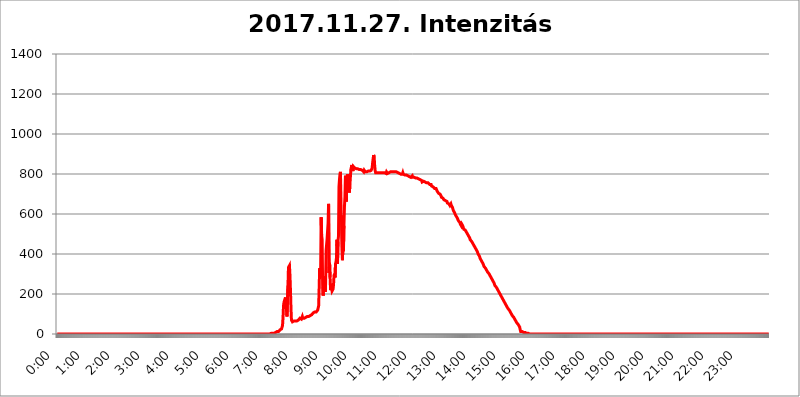
| Category | 2017.11.27. Intenzitás [W/m^2] |
|---|---|
| 0.0 | 0 |
| 0.0006944444444444445 | 0 |
| 0.001388888888888889 | 0 |
| 0.0020833333333333333 | 0 |
| 0.002777777777777778 | 0 |
| 0.003472222222222222 | 0 |
| 0.004166666666666667 | 0 |
| 0.004861111111111111 | 0 |
| 0.005555555555555556 | 0 |
| 0.0062499999999999995 | 0 |
| 0.006944444444444444 | 0 |
| 0.007638888888888889 | 0 |
| 0.008333333333333333 | 0 |
| 0.009027777777777779 | 0 |
| 0.009722222222222222 | 0 |
| 0.010416666666666666 | 0 |
| 0.011111111111111112 | 0 |
| 0.011805555555555555 | 0 |
| 0.012499999999999999 | 0 |
| 0.013194444444444444 | 0 |
| 0.013888888888888888 | 0 |
| 0.014583333333333332 | 0 |
| 0.015277777777777777 | 0 |
| 0.015972222222222224 | 0 |
| 0.016666666666666666 | 0 |
| 0.017361111111111112 | 0 |
| 0.018055555555555557 | 0 |
| 0.01875 | 0 |
| 0.019444444444444445 | 0 |
| 0.02013888888888889 | 0 |
| 0.020833333333333332 | 0 |
| 0.02152777777777778 | 0 |
| 0.022222222222222223 | 0 |
| 0.02291666666666667 | 0 |
| 0.02361111111111111 | 0 |
| 0.024305555555555556 | 0 |
| 0.024999999999999998 | 0 |
| 0.025694444444444447 | 0 |
| 0.02638888888888889 | 0 |
| 0.027083333333333334 | 0 |
| 0.027777777777777776 | 0 |
| 0.02847222222222222 | 0 |
| 0.029166666666666664 | 0 |
| 0.029861111111111113 | 0 |
| 0.030555555555555555 | 0 |
| 0.03125 | 0 |
| 0.03194444444444445 | 0 |
| 0.03263888888888889 | 0 |
| 0.03333333333333333 | 0 |
| 0.034027777777777775 | 0 |
| 0.034722222222222224 | 0 |
| 0.035416666666666666 | 0 |
| 0.036111111111111115 | 0 |
| 0.03680555555555556 | 0 |
| 0.0375 | 0 |
| 0.03819444444444444 | 0 |
| 0.03888888888888889 | 0 |
| 0.03958333333333333 | 0 |
| 0.04027777777777778 | 0 |
| 0.04097222222222222 | 0 |
| 0.041666666666666664 | 0 |
| 0.042361111111111106 | 0 |
| 0.04305555555555556 | 0 |
| 0.043750000000000004 | 0 |
| 0.044444444444444446 | 0 |
| 0.04513888888888889 | 0 |
| 0.04583333333333334 | 0 |
| 0.04652777777777778 | 0 |
| 0.04722222222222222 | 0 |
| 0.04791666666666666 | 0 |
| 0.04861111111111111 | 0 |
| 0.049305555555555554 | 0 |
| 0.049999999999999996 | 0 |
| 0.05069444444444445 | 0 |
| 0.051388888888888894 | 0 |
| 0.052083333333333336 | 0 |
| 0.05277777777777778 | 0 |
| 0.05347222222222222 | 0 |
| 0.05416666666666667 | 0 |
| 0.05486111111111111 | 0 |
| 0.05555555555555555 | 0 |
| 0.05625 | 0 |
| 0.05694444444444444 | 0 |
| 0.057638888888888885 | 0 |
| 0.05833333333333333 | 0 |
| 0.05902777777777778 | 0 |
| 0.059722222222222225 | 0 |
| 0.06041666666666667 | 0 |
| 0.061111111111111116 | 0 |
| 0.06180555555555556 | 0 |
| 0.0625 | 0 |
| 0.06319444444444444 | 0 |
| 0.06388888888888888 | 0 |
| 0.06458333333333334 | 0 |
| 0.06527777777777778 | 0 |
| 0.06597222222222222 | 0 |
| 0.06666666666666667 | 0 |
| 0.06736111111111111 | 0 |
| 0.06805555555555555 | 0 |
| 0.06874999999999999 | 0 |
| 0.06944444444444443 | 0 |
| 0.07013888888888889 | 0 |
| 0.07083333333333333 | 0 |
| 0.07152777777777779 | 0 |
| 0.07222222222222223 | 0 |
| 0.07291666666666667 | 0 |
| 0.07361111111111111 | 0 |
| 0.07430555555555556 | 0 |
| 0.075 | 0 |
| 0.07569444444444444 | 0 |
| 0.0763888888888889 | 0 |
| 0.07708333333333334 | 0 |
| 0.07777777777777778 | 0 |
| 0.07847222222222222 | 0 |
| 0.07916666666666666 | 0 |
| 0.0798611111111111 | 0 |
| 0.08055555555555556 | 0 |
| 0.08125 | 0 |
| 0.08194444444444444 | 0 |
| 0.08263888888888889 | 0 |
| 0.08333333333333333 | 0 |
| 0.08402777777777777 | 0 |
| 0.08472222222222221 | 0 |
| 0.08541666666666665 | 0 |
| 0.08611111111111112 | 0 |
| 0.08680555555555557 | 0 |
| 0.08750000000000001 | 0 |
| 0.08819444444444445 | 0 |
| 0.08888888888888889 | 0 |
| 0.08958333333333333 | 0 |
| 0.09027777777777778 | 0 |
| 0.09097222222222222 | 0 |
| 0.09166666666666667 | 0 |
| 0.09236111111111112 | 0 |
| 0.09305555555555556 | 0 |
| 0.09375 | 0 |
| 0.09444444444444444 | 0 |
| 0.09513888888888888 | 0 |
| 0.09583333333333333 | 0 |
| 0.09652777777777777 | 0 |
| 0.09722222222222222 | 0 |
| 0.09791666666666667 | 0 |
| 0.09861111111111111 | 0 |
| 0.09930555555555555 | 0 |
| 0.09999999999999999 | 0 |
| 0.10069444444444443 | 0 |
| 0.1013888888888889 | 0 |
| 0.10208333333333335 | 0 |
| 0.10277777777777779 | 0 |
| 0.10347222222222223 | 0 |
| 0.10416666666666667 | 0 |
| 0.10486111111111111 | 0 |
| 0.10555555555555556 | 0 |
| 0.10625 | 0 |
| 0.10694444444444444 | 0 |
| 0.1076388888888889 | 0 |
| 0.10833333333333334 | 0 |
| 0.10902777777777778 | 0 |
| 0.10972222222222222 | 0 |
| 0.1111111111111111 | 0 |
| 0.11180555555555556 | 0 |
| 0.11180555555555556 | 0 |
| 0.1125 | 0 |
| 0.11319444444444444 | 0 |
| 0.11388888888888889 | 0 |
| 0.11458333333333333 | 0 |
| 0.11527777777777777 | 0 |
| 0.11597222222222221 | 0 |
| 0.11666666666666665 | 0 |
| 0.1173611111111111 | 0 |
| 0.11805555555555557 | 0 |
| 0.11944444444444445 | 0 |
| 0.12013888888888889 | 0 |
| 0.12083333333333333 | 0 |
| 0.12152777777777778 | 0 |
| 0.12222222222222223 | 0 |
| 0.12291666666666667 | 0 |
| 0.12291666666666667 | 0 |
| 0.12361111111111112 | 0 |
| 0.12430555555555556 | 0 |
| 0.125 | 0 |
| 0.12569444444444444 | 0 |
| 0.12638888888888888 | 0 |
| 0.12708333333333333 | 0 |
| 0.16875 | 0 |
| 0.12847222222222224 | 0 |
| 0.12916666666666668 | 0 |
| 0.12986111111111112 | 0 |
| 0.13055555555555556 | 0 |
| 0.13125 | 0 |
| 0.13194444444444445 | 0 |
| 0.1326388888888889 | 0 |
| 0.13333333333333333 | 0 |
| 0.13402777777777777 | 0 |
| 0.13402777777777777 | 0 |
| 0.13472222222222222 | 0 |
| 0.13541666666666666 | 0 |
| 0.1361111111111111 | 0 |
| 0.13749999999999998 | 0 |
| 0.13819444444444443 | 0 |
| 0.1388888888888889 | 0 |
| 0.13958333333333334 | 0 |
| 0.14027777777777778 | 0 |
| 0.14097222222222222 | 0 |
| 0.14166666666666666 | 0 |
| 0.1423611111111111 | 0 |
| 0.14305555555555557 | 0 |
| 0.14375000000000002 | 0 |
| 0.14444444444444446 | 0 |
| 0.1451388888888889 | 0 |
| 0.1451388888888889 | 0 |
| 0.14652777777777778 | 0 |
| 0.14722222222222223 | 0 |
| 0.14791666666666667 | 0 |
| 0.1486111111111111 | 0 |
| 0.14930555555555555 | 0 |
| 0.15 | 0 |
| 0.15069444444444444 | 0 |
| 0.15138888888888888 | 0 |
| 0.15208333333333332 | 0 |
| 0.15277777777777776 | 0 |
| 0.15347222222222223 | 0 |
| 0.15416666666666667 | 0 |
| 0.15486111111111112 | 0 |
| 0.15555555555555556 | 0 |
| 0.15625 | 0 |
| 0.15694444444444444 | 0 |
| 0.15763888888888888 | 0 |
| 0.15833333333333333 | 0 |
| 0.15902777777777777 | 0 |
| 0.15972222222222224 | 0 |
| 0.16041666666666668 | 0 |
| 0.16111111111111112 | 0 |
| 0.16180555555555556 | 0 |
| 0.1625 | 0 |
| 0.16319444444444445 | 0 |
| 0.1638888888888889 | 0 |
| 0.16458333333333333 | 0 |
| 0.16527777777777777 | 0 |
| 0.16597222222222222 | 0 |
| 0.16666666666666666 | 0 |
| 0.1673611111111111 | 0 |
| 0.16805555555555554 | 0 |
| 0.16874999999999998 | 0 |
| 0.16944444444444443 | 0 |
| 0.17013888888888887 | 0 |
| 0.1708333333333333 | 0 |
| 0.17152777777777775 | 0 |
| 0.17222222222222225 | 0 |
| 0.1729166666666667 | 0 |
| 0.17361111111111113 | 0 |
| 0.17430555555555557 | 0 |
| 0.17500000000000002 | 0 |
| 0.17569444444444446 | 0 |
| 0.1763888888888889 | 0 |
| 0.17708333333333334 | 0 |
| 0.17777777777777778 | 0 |
| 0.17847222222222223 | 0 |
| 0.17916666666666667 | 0 |
| 0.1798611111111111 | 0 |
| 0.18055555555555555 | 0 |
| 0.18125 | 0 |
| 0.18194444444444444 | 0 |
| 0.1826388888888889 | 0 |
| 0.18333333333333335 | 0 |
| 0.1840277777777778 | 0 |
| 0.18472222222222223 | 0 |
| 0.18541666666666667 | 0 |
| 0.18611111111111112 | 0 |
| 0.18680555555555556 | 0 |
| 0.1875 | 0 |
| 0.18819444444444444 | 0 |
| 0.18888888888888888 | 0 |
| 0.18958333333333333 | 0 |
| 0.19027777777777777 | 0 |
| 0.1909722222222222 | 0 |
| 0.19166666666666665 | 0 |
| 0.19236111111111112 | 0 |
| 0.19305555555555554 | 0 |
| 0.19375 | 0 |
| 0.19444444444444445 | 0 |
| 0.1951388888888889 | 0 |
| 0.19583333333333333 | 0 |
| 0.19652777777777777 | 0 |
| 0.19722222222222222 | 0 |
| 0.19791666666666666 | 0 |
| 0.1986111111111111 | 0 |
| 0.19930555555555554 | 0 |
| 0.19999999999999998 | 0 |
| 0.20069444444444443 | 0 |
| 0.20138888888888887 | 0 |
| 0.2020833333333333 | 0 |
| 0.2027777777777778 | 0 |
| 0.2034722222222222 | 0 |
| 0.2041666666666667 | 0 |
| 0.20486111111111113 | 0 |
| 0.20555555555555557 | 0 |
| 0.20625000000000002 | 0 |
| 0.20694444444444446 | 0 |
| 0.2076388888888889 | 0 |
| 0.20833333333333334 | 0 |
| 0.20902777777777778 | 0 |
| 0.20972222222222223 | 0 |
| 0.21041666666666667 | 0 |
| 0.2111111111111111 | 0 |
| 0.21180555555555555 | 0 |
| 0.2125 | 0 |
| 0.21319444444444444 | 0 |
| 0.2138888888888889 | 0 |
| 0.21458333333333335 | 0 |
| 0.2152777777777778 | 0 |
| 0.21597222222222223 | 0 |
| 0.21666666666666667 | 0 |
| 0.21736111111111112 | 0 |
| 0.21805555555555556 | 0 |
| 0.21875 | 0 |
| 0.21944444444444444 | 0 |
| 0.22013888888888888 | 0 |
| 0.22083333333333333 | 0 |
| 0.22152777777777777 | 0 |
| 0.2222222222222222 | 0 |
| 0.22291666666666665 | 0 |
| 0.2236111111111111 | 0 |
| 0.22430555555555556 | 0 |
| 0.225 | 0 |
| 0.22569444444444445 | 0 |
| 0.2263888888888889 | 0 |
| 0.22708333333333333 | 0 |
| 0.22777777777777777 | 0 |
| 0.22847222222222222 | 0 |
| 0.22916666666666666 | 0 |
| 0.2298611111111111 | 0 |
| 0.23055555555555554 | 0 |
| 0.23124999999999998 | 0 |
| 0.23194444444444443 | 0 |
| 0.23263888888888887 | 0 |
| 0.2333333333333333 | 0 |
| 0.2340277777777778 | 0 |
| 0.2347222222222222 | 0 |
| 0.2354166666666667 | 0 |
| 0.23611111111111113 | 0 |
| 0.23680555555555557 | 0 |
| 0.23750000000000002 | 0 |
| 0.23819444444444446 | 0 |
| 0.2388888888888889 | 0 |
| 0.23958333333333334 | 0 |
| 0.24027777777777778 | 0 |
| 0.24097222222222223 | 0 |
| 0.24166666666666667 | 0 |
| 0.2423611111111111 | 0 |
| 0.24305555555555555 | 0 |
| 0.24375 | 0 |
| 0.24444444444444446 | 0 |
| 0.24513888888888888 | 0 |
| 0.24583333333333335 | 0 |
| 0.2465277777777778 | 0 |
| 0.24722222222222223 | 0 |
| 0.24791666666666667 | 0 |
| 0.24861111111111112 | 0 |
| 0.24930555555555556 | 0 |
| 0.25 | 0 |
| 0.25069444444444444 | 0 |
| 0.2513888888888889 | 0 |
| 0.2520833333333333 | 0 |
| 0.25277777777777777 | 0 |
| 0.2534722222222222 | 0 |
| 0.25416666666666665 | 0 |
| 0.2548611111111111 | 0 |
| 0.2555555555555556 | 0 |
| 0.25625000000000003 | 0 |
| 0.2569444444444445 | 0 |
| 0.2576388888888889 | 0 |
| 0.25833333333333336 | 0 |
| 0.2590277777777778 | 0 |
| 0.25972222222222224 | 0 |
| 0.2604166666666667 | 0 |
| 0.2611111111111111 | 0 |
| 0.26180555555555557 | 0 |
| 0.2625 | 0 |
| 0.26319444444444445 | 0 |
| 0.2638888888888889 | 0 |
| 0.26458333333333334 | 0 |
| 0.2652777777777778 | 0 |
| 0.2659722222222222 | 0 |
| 0.26666666666666666 | 0 |
| 0.2673611111111111 | 0 |
| 0.26805555555555555 | 0 |
| 0.26875 | 0 |
| 0.26944444444444443 | 0 |
| 0.2701388888888889 | 0 |
| 0.2708333333333333 | 0 |
| 0.27152777777777776 | 0 |
| 0.2722222222222222 | 0 |
| 0.27291666666666664 | 0 |
| 0.2736111111111111 | 0 |
| 0.2743055555555555 | 0 |
| 0.27499999999999997 | 0 |
| 0.27569444444444446 | 0 |
| 0.27638888888888885 | 0 |
| 0.27708333333333335 | 0 |
| 0.2777777777777778 | 0 |
| 0.27847222222222223 | 0 |
| 0.2791666666666667 | 0 |
| 0.2798611111111111 | 0 |
| 0.28055555555555556 | 0 |
| 0.28125 | 0 |
| 0.28194444444444444 | 0 |
| 0.2826388888888889 | 0 |
| 0.2833333333333333 | 0 |
| 0.28402777777777777 | 0 |
| 0.2847222222222222 | 0 |
| 0.28541666666666665 | 0 |
| 0.28611111111111115 | 0 |
| 0.28680555555555554 | 0 |
| 0.28750000000000003 | 0 |
| 0.2881944444444445 | 0 |
| 0.2888888888888889 | 0 |
| 0.28958333333333336 | 0 |
| 0.2902777777777778 | 0 |
| 0.29097222222222224 | 0 |
| 0.2916666666666667 | 0 |
| 0.2923611111111111 | 0 |
| 0.29305555555555557 | 0 |
| 0.29375 | 0 |
| 0.29444444444444445 | 0 |
| 0.2951388888888889 | 0 |
| 0.29583333333333334 | 0 |
| 0.2965277777777778 | 0 |
| 0.2972222222222222 | 0 |
| 0.29791666666666666 | 0 |
| 0.2986111111111111 | 0 |
| 0.29930555555555555 | 3.525 |
| 0.3 | 3.525 |
| 0.30069444444444443 | 3.525 |
| 0.3013888888888889 | 3.525 |
| 0.3020833333333333 | 3.525 |
| 0.30277777777777776 | 3.525 |
| 0.3034722222222222 | 3.525 |
| 0.30416666666666664 | 3.525 |
| 0.3048611111111111 | 7.887 |
| 0.3055555555555555 | 7.887 |
| 0.30624999999999997 | 7.887 |
| 0.3069444444444444 | 7.887 |
| 0.3076388888888889 | 12.257 |
| 0.30833333333333335 | 12.257 |
| 0.3090277777777778 | 12.257 |
| 0.30972222222222223 | 12.257 |
| 0.3104166666666667 | 12.257 |
| 0.3111111111111111 | 16.636 |
| 0.31180555555555556 | 16.636 |
| 0.3125 | 21.024 |
| 0.31319444444444444 | 21.024 |
| 0.3138888888888889 | 21.024 |
| 0.3145833333333333 | 25.419 |
| 0.31527777777777777 | 29.823 |
| 0.3159722222222222 | 43.079 |
| 0.31666666666666665 | 83.205 |
| 0.31736111111111115 | 141.884 |
| 0.31805555555555554 | 160.056 |
| 0.31875000000000003 | 160.056 |
| 0.3194444444444445 | 164.605 |
| 0.3201388888888889 | 182.82 |
| 0.32083333333333336 | 150.964 |
| 0.3215277777777778 | 119.235 |
| 0.32222222222222224 | 87.692 |
| 0.3229166666666667 | 87.692 |
| 0.3236111111111111 | 242.127 |
| 0.32430555555555557 | 333.113 |
| 0.325 | 337.639 |
| 0.32569444444444445 | 342.162 |
| 0.3263888888888889 | 292.259 |
| 0.32708333333333334 | 219.309 |
| 0.3277777777777778 | 132.814 |
| 0.3284722222222222 | 69.775 |
| 0.32916666666666666 | 65.31 |
| 0.3298611111111111 | 60.85 |
| 0.33055555555555555 | 60.85 |
| 0.33125 | 60.85 |
| 0.33194444444444443 | 65.31 |
| 0.3326388888888889 | 65.31 |
| 0.3333333333333333 | 65.31 |
| 0.3340277777777778 | 65.31 |
| 0.3347222222222222 | 65.31 |
| 0.3354166666666667 | 65.31 |
| 0.3361111111111111 | 65.31 |
| 0.3368055555555556 | 69.775 |
| 0.33749999999999997 | 69.775 |
| 0.33819444444444446 | 69.775 |
| 0.33888888888888885 | 69.775 |
| 0.33958333333333335 | 69.775 |
| 0.34027777777777773 | 78.722 |
| 0.34097222222222223 | 78.722 |
| 0.3416666666666666 | 78.722 |
| 0.3423611111111111 | 74.246 |
| 0.3430555555555555 | 74.246 |
| 0.34375 | 87.692 |
| 0.3444444444444445 | 78.722 |
| 0.3451388888888889 | 78.722 |
| 0.3458333333333334 | 78.722 |
| 0.34652777777777777 | 78.722 |
| 0.34722222222222227 | 83.205 |
| 0.34791666666666665 | 83.205 |
| 0.34861111111111115 | 83.205 |
| 0.34930555555555554 | 83.205 |
| 0.35000000000000003 | 83.205 |
| 0.3506944444444444 | 87.692 |
| 0.3513888888888889 | 87.692 |
| 0.3520833333333333 | 87.692 |
| 0.3527777777777778 | 87.692 |
| 0.3534722222222222 | 87.692 |
| 0.3541666666666667 | 92.184 |
| 0.3548611111111111 | 92.184 |
| 0.35555555555555557 | 92.184 |
| 0.35625 | 96.682 |
| 0.35694444444444445 | 96.682 |
| 0.3576388888888889 | 101.184 |
| 0.35833333333333334 | 101.184 |
| 0.3590277777777778 | 105.69 |
| 0.3597222222222222 | 105.69 |
| 0.36041666666666666 | 110.201 |
| 0.3611111111111111 | 110.201 |
| 0.36180555555555555 | 110.201 |
| 0.3625 | 110.201 |
| 0.36319444444444443 | 110.201 |
| 0.3638888888888889 | 114.716 |
| 0.3645833333333333 | 114.716 |
| 0.3652777777777778 | 119.235 |
| 0.3659722222222222 | 123.758 |
| 0.3666666666666667 | 141.884 |
| 0.3673611111111111 | 146.423 |
| 0.3680555555555556 | 328.584 |
| 0.36874999999999997 | 283.156 |
| 0.36944444444444446 | 328.584 |
| 0.37013888888888885 | 583.779 |
| 0.37083333333333335 | 493.475 |
| 0.37152777777777773 | 471.582 |
| 0.37222222222222223 | 242.127 |
| 0.3729166666666666 | 191.937 |
| 0.3736111111111111 | 283.156 |
| 0.3743055555555555 | 251.251 |
| 0.375 | 287.709 |
| 0.3756944444444445 | 210.182 |
| 0.3763888888888889 | 251.251 |
| 0.3770833333333334 | 418.492 |
| 0.37777777777777777 | 414.035 |
| 0.37847222222222227 | 475.972 |
| 0.37916666666666665 | 515.223 |
| 0.37986111111111115 | 553.986 |
| 0.38055555555555554 | 650.667 |
| 0.38125000000000003 | 305.898 |
| 0.3819444444444444 | 355.712 |
| 0.3826388888888889 | 283.156 |
| 0.3833333333333333 | 219.309 |
| 0.3840277777777778 | 251.251 |
| 0.3847222222222222 | 228.436 |
| 0.3854166666666667 | 214.746 |
| 0.3861111111111111 | 219.309 |
| 0.38680555555555557 | 223.873 |
| 0.3875 | 246.689 |
| 0.38819444444444445 | 292.259 |
| 0.3888888888888889 | 301.354 |
| 0.38958333333333334 | 283.156 |
| 0.3902777777777778 | 351.198 |
| 0.3909722222222222 | 360.221 |
| 0.39166666666666666 | 382.715 |
| 0.3923611111111111 | 471.582 |
| 0.39305555555555555 | 351.198 |
| 0.39375 | 462.786 |
| 0.39444444444444443 | 489.108 |
| 0.3951388888888889 | 735.89 |
| 0.3958333333333333 | 771.559 |
| 0.3965277777777778 | 798.974 |
| 0.3972222222222222 | 810.641 |
| 0.3979166666666667 | 562.53 |
| 0.3986111111111111 | 592.233 |
| 0.3993055555555556 | 588.009 |
| 0.39999999999999997 | 369.23 |
| 0.40069444444444446 | 445.129 |
| 0.40138888888888885 | 414.035 |
| 0.40208333333333335 | 541.121 |
| 0.40277777777777773 | 634.105 |
| 0.40347222222222223 | 683.473 |
| 0.4041666666666666 | 791.169 |
| 0.4048611111111111 | 787.258 |
| 0.4055555555555555 | 663.019 |
| 0.40625 | 767.62 |
| 0.4069444444444445 | 798.974 |
| 0.4076388888888889 | 798.974 |
| 0.4083333333333334 | 775.492 |
| 0.40902777777777777 | 783.342 |
| 0.40972222222222227 | 707.8 |
| 0.41041666666666665 | 743.859 |
| 0.41111111111111115 | 739.877 |
| 0.41180555555555554 | 822.26 |
| 0.41250000000000003 | 818.392 |
| 0.4131944444444444 | 845.365 |
| 0.4138888888888889 | 841.526 |
| 0.4145833333333333 | 814.519 |
| 0.4152777777777778 | 837.682 |
| 0.4159722222222222 | 833.834 |
| 0.4166666666666667 | 833.834 |
| 0.4173611111111111 | 829.981 |
| 0.41805555555555557 | 829.981 |
| 0.41875 | 826.123 |
| 0.41944444444444445 | 826.123 |
| 0.4201388888888889 | 822.26 |
| 0.42083333333333334 | 822.26 |
| 0.4215277777777778 | 826.123 |
| 0.4222222222222222 | 822.26 |
| 0.42291666666666666 | 822.26 |
| 0.4236111111111111 | 822.26 |
| 0.42430555555555555 | 822.26 |
| 0.425 | 822.26 |
| 0.42569444444444443 | 822.26 |
| 0.4263888888888889 | 818.392 |
| 0.4270833333333333 | 818.392 |
| 0.4277777777777778 | 818.392 |
| 0.4284722222222222 | 818.392 |
| 0.4291666666666667 | 814.519 |
| 0.4298611111111111 | 810.641 |
| 0.4305555555555556 | 818.392 |
| 0.43124999999999997 | 814.519 |
| 0.43194444444444446 | 810.641 |
| 0.43263888888888885 | 810.641 |
| 0.43333333333333335 | 810.641 |
| 0.43402777777777773 | 810.641 |
| 0.43472222222222223 | 810.641 |
| 0.4354166666666666 | 810.641 |
| 0.4361111111111111 | 814.519 |
| 0.4368055555555555 | 814.519 |
| 0.4375 | 810.641 |
| 0.4381944444444445 | 814.519 |
| 0.4388888888888889 | 814.519 |
| 0.4395833333333334 | 814.519 |
| 0.44027777777777777 | 818.392 |
| 0.44097222222222227 | 822.26 |
| 0.44166666666666665 | 829.981 |
| 0.44236111111111115 | 856.855 |
| 0.44305555555555554 | 875.918 |
| 0.44375000000000003 | 894.885 |
| 0.4444444444444444 | 887.309 |
| 0.4451388888888889 | 845.365 |
| 0.4458333333333333 | 818.392 |
| 0.4465277777777778 | 806.757 |
| 0.4472222222222222 | 810.641 |
| 0.4479166666666667 | 806.757 |
| 0.4486111111111111 | 806.757 |
| 0.44930555555555557 | 806.757 |
| 0.45 | 806.757 |
| 0.45069444444444445 | 806.757 |
| 0.4513888888888889 | 806.757 |
| 0.45208333333333334 | 806.757 |
| 0.4527777777777778 | 806.757 |
| 0.4534722222222222 | 806.757 |
| 0.45416666666666666 | 806.757 |
| 0.4548611111111111 | 806.757 |
| 0.45555555555555555 | 802.868 |
| 0.45625 | 802.868 |
| 0.45694444444444443 | 806.757 |
| 0.4576388888888889 | 806.757 |
| 0.4583333333333333 | 806.757 |
| 0.4590277777777778 | 806.757 |
| 0.4597222222222222 | 806.757 |
| 0.4604166666666667 | 806.757 |
| 0.4611111111111111 | 802.868 |
| 0.4618055555555556 | 810.641 |
| 0.46249999999999997 | 806.757 |
| 0.46319444444444446 | 802.868 |
| 0.46388888888888885 | 806.757 |
| 0.46458333333333335 | 806.757 |
| 0.46527777777777773 | 806.757 |
| 0.46597222222222223 | 806.757 |
| 0.4666666666666666 | 806.757 |
| 0.4673611111111111 | 810.641 |
| 0.4680555555555555 | 810.641 |
| 0.46875 | 810.641 |
| 0.4694444444444445 | 810.641 |
| 0.4701388888888889 | 810.641 |
| 0.4708333333333334 | 810.641 |
| 0.47152777777777777 | 810.641 |
| 0.47222222222222227 | 806.757 |
| 0.47291666666666665 | 806.757 |
| 0.47361111111111115 | 810.641 |
| 0.47430555555555554 | 810.641 |
| 0.47500000000000003 | 806.757 |
| 0.4756944444444444 | 810.641 |
| 0.4763888888888889 | 806.757 |
| 0.4770833333333333 | 806.757 |
| 0.4777777777777778 | 806.757 |
| 0.4784722222222222 | 802.868 |
| 0.4791666666666667 | 802.868 |
| 0.4798611111111111 | 802.868 |
| 0.48055555555555557 | 802.868 |
| 0.48125 | 802.868 |
| 0.48194444444444445 | 798.974 |
| 0.4826388888888889 | 798.974 |
| 0.48333333333333334 | 802.868 |
| 0.4840277777777778 | 798.974 |
| 0.4847222222222222 | 806.757 |
| 0.48541666666666666 | 798.974 |
| 0.4861111111111111 | 798.974 |
| 0.48680555555555555 | 798.974 |
| 0.4875 | 795.074 |
| 0.48819444444444443 | 791.169 |
| 0.4888888888888889 | 795.074 |
| 0.4895833333333333 | 795.074 |
| 0.4902777777777778 | 791.169 |
| 0.4909722222222222 | 791.169 |
| 0.4916666666666667 | 791.169 |
| 0.4923611111111111 | 791.169 |
| 0.4930555555555556 | 787.258 |
| 0.49374999999999997 | 787.258 |
| 0.49444444444444446 | 783.342 |
| 0.49513888888888885 | 783.342 |
| 0.49583333333333335 | 783.342 |
| 0.49652777777777773 | 783.342 |
| 0.49722222222222223 | 783.342 |
| 0.4979166666666666 | 791.169 |
| 0.4986111111111111 | 783.342 |
| 0.4993055555555555 | 783.342 |
| 0.5 | 783.342 |
| 0.5006944444444444 | 783.342 |
| 0.5013888888888889 | 783.342 |
| 0.5020833333333333 | 783.342 |
| 0.5027777777777778 | 779.42 |
| 0.5034722222222222 | 775.492 |
| 0.5041666666666667 | 779.42 |
| 0.5048611111111111 | 779.42 |
| 0.5055555555555555 | 775.492 |
| 0.50625 | 775.492 |
| 0.5069444444444444 | 775.492 |
| 0.5076388888888889 | 775.492 |
| 0.5083333333333333 | 771.559 |
| 0.5090277777777777 | 771.559 |
| 0.5097222222222222 | 771.559 |
| 0.5104166666666666 | 771.559 |
| 0.5111111111111112 | 767.62 |
| 0.5118055555555555 | 759.723 |
| 0.5125000000000001 | 763.674 |
| 0.5131944444444444 | 763.674 |
| 0.513888888888889 | 763.674 |
| 0.5145833333333333 | 763.674 |
| 0.5152777777777778 | 759.723 |
| 0.5159722222222222 | 759.723 |
| 0.5166666666666667 | 759.723 |
| 0.517361111111111 | 759.723 |
| 0.5180555555555556 | 755.766 |
| 0.5187499999999999 | 755.766 |
| 0.5194444444444445 | 751.803 |
| 0.5201388888888888 | 755.766 |
| 0.5208333333333334 | 751.803 |
| 0.5215277777777778 | 751.803 |
| 0.5222222222222223 | 747.834 |
| 0.5229166666666667 | 751.803 |
| 0.5236111111111111 | 751.803 |
| 0.5243055555555556 | 747.834 |
| 0.525 | 739.877 |
| 0.5256944444444445 | 739.877 |
| 0.5263888888888889 | 739.877 |
| 0.5270833333333333 | 735.89 |
| 0.5277777777777778 | 731.896 |
| 0.5284722222222222 | 731.896 |
| 0.5291666666666667 | 727.896 |
| 0.5298611111111111 | 731.896 |
| 0.5305555555555556 | 727.896 |
| 0.53125 | 727.896 |
| 0.5319444444444444 | 723.889 |
| 0.5326388888888889 | 715.858 |
| 0.5333333333333333 | 715.858 |
| 0.5340277777777778 | 711.832 |
| 0.5347222222222222 | 703.762 |
| 0.5354166666666667 | 699.717 |
| 0.5361111111111111 | 699.717 |
| 0.5368055555555555 | 699.717 |
| 0.5375 | 699.717 |
| 0.5381944444444444 | 691.608 |
| 0.5388888888888889 | 683.473 |
| 0.5395833333333333 | 679.395 |
| 0.5402777777777777 | 683.473 |
| 0.5409722222222222 | 679.395 |
| 0.5416666666666666 | 679.395 |
| 0.5423611111111112 | 671.22 |
| 0.5430555555555555 | 671.22 |
| 0.5437500000000001 | 667.123 |
| 0.5444444444444444 | 667.123 |
| 0.545138888888889 | 663.019 |
| 0.5458333333333333 | 667.123 |
| 0.5465277777777778 | 663.019 |
| 0.5472222222222222 | 654.791 |
| 0.5479166666666667 | 658.909 |
| 0.548611111111111 | 654.791 |
| 0.5493055555555556 | 650.667 |
| 0.5499999999999999 | 654.791 |
| 0.5506944444444445 | 642.4 |
| 0.5513888888888888 | 642.4 |
| 0.5520833333333334 | 650.667 |
| 0.5527777777777778 | 642.4 |
| 0.5534722222222223 | 638.256 |
| 0.5541666666666667 | 634.105 |
| 0.5548611111111111 | 625.784 |
| 0.5555555555555556 | 617.436 |
| 0.55625 | 617.436 |
| 0.5569444444444445 | 609.062 |
| 0.5576388888888889 | 604.864 |
| 0.5583333333333333 | 596.45 |
| 0.5590277777777778 | 600.661 |
| 0.5597222222222222 | 588.009 |
| 0.5604166666666667 | 588.009 |
| 0.5611111111111111 | 579.542 |
| 0.5618055555555556 | 579.542 |
| 0.5625 | 566.793 |
| 0.5631944444444444 | 571.049 |
| 0.5638888888888889 | 566.793 |
| 0.5645833333333333 | 558.261 |
| 0.5652777777777778 | 549.704 |
| 0.5659722222222222 | 553.986 |
| 0.5666666666666667 | 541.121 |
| 0.5673611111111111 | 549.704 |
| 0.5680555555555555 | 549.704 |
| 0.56875 | 541.121 |
| 0.5694444444444444 | 532.513 |
| 0.5701388888888889 | 523.88 |
| 0.5708333333333333 | 523.88 |
| 0.5715277777777777 | 519.555 |
| 0.5722222222222222 | 519.555 |
| 0.5729166666666666 | 515.223 |
| 0.5736111111111112 | 510.885 |
| 0.5743055555555555 | 506.542 |
| 0.5750000000000001 | 502.192 |
| 0.5756944444444444 | 497.836 |
| 0.576388888888889 | 493.475 |
| 0.5770833333333333 | 493.475 |
| 0.5777777777777778 | 489.108 |
| 0.5784722222222222 | 480.356 |
| 0.5791666666666667 | 471.582 |
| 0.579861111111111 | 475.972 |
| 0.5805555555555556 | 471.582 |
| 0.5812499999999999 | 462.786 |
| 0.5819444444444445 | 458.38 |
| 0.5826388888888888 | 453.968 |
| 0.5833333333333334 | 453.968 |
| 0.5840277777777778 | 449.551 |
| 0.5847222222222223 | 440.702 |
| 0.5854166666666667 | 436.27 |
| 0.5861111111111111 | 431.833 |
| 0.5868055555555556 | 427.39 |
| 0.5875 | 422.943 |
| 0.5881944444444445 | 418.492 |
| 0.5888888888888889 | 414.035 |
| 0.5895833333333333 | 409.574 |
| 0.5902777777777778 | 400.638 |
| 0.5909722222222222 | 400.638 |
| 0.5916666666666667 | 396.164 |
| 0.5923611111111111 | 387.202 |
| 0.5930555555555556 | 378.224 |
| 0.59375 | 378.224 |
| 0.5944444444444444 | 369.23 |
| 0.5951388888888889 | 364.728 |
| 0.5958333333333333 | 360.221 |
| 0.5965277777777778 | 360.221 |
| 0.5972222222222222 | 351.198 |
| 0.5979166666666667 | 346.682 |
| 0.5986111111111111 | 337.639 |
| 0.5993055555555555 | 337.639 |
| 0.6 | 333.113 |
| 0.6006944444444444 | 328.584 |
| 0.6013888888888889 | 324.052 |
| 0.6020833333333333 | 319.517 |
| 0.6027777777777777 | 314.98 |
| 0.6034722222222222 | 310.44 |
| 0.6041666666666666 | 305.898 |
| 0.6048611111111112 | 305.898 |
| 0.6055555555555555 | 301.354 |
| 0.6062500000000001 | 296.808 |
| 0.6069444444444444 | 292.259 |
| 0.607638888888889 | 287.709 |
| 0.6083333333333333 | 283.156 |
| 0.6090277777777778 | 278.603 |
| 0.6097222222222222 | 274.047 |
| 0.6104166666666667 | 269.49 |
| 0.611111111111111 | 264.932 |
| 0.6118055555555556 | 260.373 |
| 0.6124999999999999 | 255.813 |
| 0.6131944444444445 | 251.251 |
| 0.6138888888888888 | 242.127 |
| 0.6145833333333334 | 242.127 |
| 0.6152777777777778 | 237.564 |
| 0.6159722222222223 | 233 |
| 0.6166666666666667 | 228.436 |
| 0.6173611111111111 | 223.873 |
| 0.6180555555555556 | 219.309 |
| 0.61875 | 214.746 |
| 0.6194444444444445 | 210.182 |
| 0.6201388888888889 | 205.62 |
| 0.6208333333333333 | 201.058 |
| 0.6215277777777778 | 196.497 |
| 0.6222222222222222 | 191.937 |
| 0.6229166666666667 | 187.378 |
| 0.6236111111111111 | 182.82 |
| 0.6243055555555556 | 178.264 |
| 0.625 | 173.709 |
| 0.6256944444444444 | 169.156 |
| 0.6263888888888889 | 164.605 |
| 0.6270833333333333 | 160.056 |
| 0.6277777777777778 | 155.509 |
| 0.6284722222222222 | 150.964 |
| 0.6291666666666667 | 146.423 |
| 0.6298611111111111 | 141.884 |
| 0.6305555555555555 | 137.347 |
| 0.63125 | 137.347 |
| 0.6319444444444444 | 128.284 |
| 0.6326388888888889 | 128.284 |
| 0.6333333333333333 | 123.758 |
| 0.6340277777777777 | 119.235 |
| 0.6347222222222222 | 114.716 |
| 0.6354166666666666 | 110.201 |
| 0.6361111111111112 | 110.201 |
| 0.6368055555555555 | 101.184 |
| 0.6375000000000001 | 96.682 |
| 0.6381944444444444 | 92.184 |
| 0.638888888888889 | 87.692 |
| 0.6395833333333333 | 87.692 |
| 0.6402777777777778 | 83.205 |
| 0.6409722222222222 | 78.722 |
| 0.6416666666666667 | 74.246 |
| 0.642361111111111 | 69.775 |
| 0.6430555555555556 | 65.31 |
| 0.6437499999999999 | 65.31 |
| 0.6444444444444445 | 56.398 |
| 0.6451388888888888 | 51.951 |
| 0.6458333333333334 | 51.951 |
| 0.6465277777777778 | 47.511 |
| 0.6472222222222223 | 43.079 |
| 0.6479166666666667 | 43.079 |
| 0.6486111111111111 | 34.234 |
| 0.6493055555555556 | 21.024 |
| 0.65 | 12.257 |
| 0.6506944444444445 | 12.257 |
| 0.6513888888888889 | 12.257 |
| 0.6520833333333333 | 12.257 |
| 0.6527777777777778 | 7.887 |
| 0.6534722222222222 | 7.887 |
| 0.6541666666666667 | 7.887 |
| 0.6548611111111111 | 7.887 |
| 0.6555555555555556 | 7.887 |
| 0.65625 | 7.887 |
| 0.6569444444444444 | 3.525 |
| 0.6576388888888889 | 3.525 |
| 0.6583333333333333 | 3.525 |
| 0.6590277777777778 | 3.525 |
| 0.6597222222222222 | 3.525 |
| 0.6604166666666667 | 3.525 |
| 0.6611111111111111 | 3.525 |
| 0.6618055555555555 | 3.525 |
| 0.6625 | 0 |
| 0.6631944444444444 | 3.525 |
| 0.6638888888888889 | 0 |
| 0.6645833333333333 | 0 |
| 0.6652777777777777 | 0 |
| 0.6659722222222222 | 0 |
| 0.6666666666666666 | 0 |
| 0.6673611111111111 | 0 |
| 0.6680555555555556 | 0 |
| 0.6687500000000001 | 0 |
| 0.6694444444444444 | 0 |
| 0.6701388888888888 | 0 |
| 0.6708333333333334 | 0 |
| 0.6715277777777778 | 0 |
| 0.6722222222222222 | 0 |
| 0.6729166666666666 | 0 |
| 0.6736111111111112 | 0 |
| 0.6743055555555556 | 0 |
| 0.6749999999999999 | 0 |
| 0.6756944444444444 | 0 |
| 0.6763888888888889 | 0 |
| 0.6770833333333334 | 0 |
| 0.6777777777777777 | 0 |
| 0.6784722222222223 | 0 |
| 0.6791666666666667 | 0 |
| 0.6798611111111111 | 0 |
| 0.6805555555555555 | 0 |
| 0.68125 | 0 |
| 0.6819444444444445 | 0 |
| 0.6826388888888889 | 0 |
| 0.6833333333333332 | 0 |
| 0.6840277777777778 | 0 |
| 0.6847222222222222 | 0 |
| 0.6854166666666667 | 0 |
| 0.686111111111111 | 0 |
| 0.6868055555555556 | 0 |
| 0.6875 | 0 |
| 0.6881944444444444 | 0 |
| 0.688888888888889 | 0 |
| 0.6895833333333333 | 0 |
| 0.6902777777777778 | 0 |
| 0.6909722222222222 | 0 |
| 0.6916666666666668 | 0 |
| 0.6923611111111111 | 0 |
| 0.6930555555555555 | 0 |
| 0.69375 | 0 |
| 0.6944444444444445 | 0 |
| 0.6951388888888889 | 0 |
| 0.6958333333333333 | 0 |
| 0.6965277777777777 | 0 |
| 0.6972222222222223 | 0 |
| 0.6979166666666666 | 0 |
| 0.6986111111111111 | 0 |
| 0.6993055555555556 | 0 |
| 0.7000000000000001 | 0 |
| 0.7006944444444444 | 0 |
| 0.7013888888888888 | 0 |
| 0.7020833333333334 | 0 |
| 0.7027777777777778 | 0 |
| 0.7034722222222222 | 0 |
| 0.7041666666666666 | 0 |
| 0.7048611111111112 | 0 |
| 0.7055555555555556 | 0 |
| 0.7062499999999999 | 0 |
| 0.7069444444444444 | 0 |
| 0.7076388888888889 | 0 |
| 0.7083333333333334 | 0 |
| 0.7090277777777777 | 0 |
| 0.7097222222222223 | 0 |
| 0.7104166666666667 | 0 |
| 0.7111111111111111 | 0 |
| 0.7118055555555555 | 0 |
| 0.7125 | 0 |
| 0.7131944444444445 | 0 |
| 0.7138888888888889 | 0 |
| 0.7145833333333332 | 0 |
| 0.7152777777777778 | 0 |
| 0.7159722222222222 | 0 |
| 0.7166666666666667 | 0 |
| 0.717361111111111 | 0 |
| 0.7180555555555556 | 0 |
| 0.71875 | 0 |
| 0.7194444444444444 | 0 |
| 0.720138888888889 | 0 |
| 0.7208333333333333 | 0 |
| 0.7215277777777778 | 0 |
| 0.7222222222222222 | 0 |
| 0.7229166666666668 | 0 |
| 0.7236111111111111 | 0 |
| 0.7243055555555555 | 0 |
| 0.725 | 0 |
| 0.7256944444444445 | 0 |
| 0.7263888888888889 | 0 |
| 0.7270833333333333 | 0 |
| 0.7277777777777777 | 0 |
| 0.7284722222222223 | 0 |
| 0.7291666666666666 | 0 |
| 0.7298611111111111 | 0 |
| 0.7305555555555556 | 0 |
| 0.7312500000000001 | 0 |
| 0.7319444444444444 | 0 |
| 0.7326388888888888 | 0 |
| 0.7333333333333334 | 0 |
| 0.7340277777777778 | 0 |
| 0.7347222222222222 | 0 |
| 0.7354166666666666 | 0 |
| 0.7361111111111112 | 0 |
| 0.7368055555555556 | 0 |
| 0.7374999999999999 | 0 |
| 0.7381944444444444 | 0 |
| 0.7388888888888889 | 0 |
| 0.7395833333333334 | 0 |
| 0.7402777777777777 | 0 |
| 0.7409722222222223 | 0 |
| 0.7416666666666667 | 0 |
| 0.7423611111111111 | 0 |
| 0.7430555555555555 | 0 |
| 0.74375 | 0 |
| 0.7444444444444445 | 0 |
| 0.7451388888888889 | 0 |
| 0.7458333333333332 | 0 |
| 0.7465277777777778 | 0 |
| 0.7472222222222222 | 0 |
| 0.7479166666666667 | 0 |
| 0.748611111111111 | 0 |
| 0.7493055555555556 | 0 |
| 0.75 | 0 |
| 0.7506944444444444 | 0 |
| 0.751388888888889 | 0 |
| 0.7520833333333333 | 0 |
| 0.7527777777777778 | 0 |
| 0.7534722222222222 | 0 |
| 0.7541666666666668 | 0 |
| 0.7548611111111111 | 0 |
| 0.7555555555555555 | 0 |
| 0.75625 | 0 |
| 0.7569444444444445 | 0 |
| 0.7576388888888889 | 0 |
| 0.7583333333333333 | 0 |
| 0.7590277777777777 | 0 |
| 0.7597222222222223 | 0 |
| 0.7604166666666666 | 0 |
| 0.7611111111111111 | 0 |
| 0.7618055555555556 | 0 |
| 0.7625000000000001 | 0 |
| 0.7631944444444444 | 0 |
| 0.7638888888888888 | 0 |
| 0.7645833333333334 | 0 |
| 0.7652777777777778 | 0 |
| 0.7659722222222222 | 0 |
| 0.7666666666666666 | 0 |
| 0.7673611111111112 | 0 |
| 0.7680555555555556 | 0 |
| 0.7687499999999999 | 0 |
| 0.7694444444444444 | 0 |
| 0.7701388888888889 | 0 |
| 0.7708333333333334 | 0 |
| 0.7715277777777777 | 0 |
| 0.7722222222222223 | 0 |
| 0.7729166666666667 | 0 |
| 0.7736111111111111 | 0 |
| 0.7743055555555555 | 0 |
| 0.775 | 0 |
| 0.7756944444444445 | 0 |
| 0.7763888888888889 | 0 |
| 0.7770833333333332 | 0 |
| 0.7777777777777778 | 0 |
| 0.7784722222222222 | 0 |
| 0.7791666666666667 | 0 |
| 0.779861111111111 | 0 |
| 0.7805555555555556 | 0 |
| 0.78125 | 0 |
| 0.7819444444444444 | 0 |
| 0.782638888888889 | 0 |
| 0.7833333333333333 | 0 |
| 0.7840277777777778 | 0 |
| 0.7847222222222222 | 0 |
| 0.7854166666666668 | 0 |
| 0.7861111111111111 | 0 |
| 0.7868055555555555 | 0 |
| 0.7875 | 0 |
| 0.7881944444444445 | 0 |
| 0.7888888888888889 | 0 |
| 0.7895833333333333 | 0 |
| 0.7902777777777777 | 0 |
| 0.7909722222222223 | 0 |
| 0.7916666666666666 | 0 |
| 0.7923611111111111 | 0 |
| 0.7930555555555556 | 0 |
| 0.7937500000000001 | 0 |
| 0.7944444444444444 | 0 |
| 0.7951388888888888 | 0 |
| 0.7958333333333334 | 0 |
| 0.7965277777777778 | 0 |
| 0.7972222222222222 | 0 |
| 0.7979166666666666 | 0 |
| 0.7986111111111112 | 0 |
| 0.7993055555555556 | 0 |
| 0.7999999999999999 | 0 |
| 0.8006944444444444 | 0 |
| 0.8013888888888889 | 0 |
| 0.8020833333333334 | 0 |
| 0.8027777777777777 | 0 |
| 0.8034722222222223 | 0 |
| 0.8041666666666667 | 0 |
| 0.8048611111111111 | 0 |
| 0.8055555555555555 | 0 |
| 0.80625 | 0 |
| 0.8069444444444445 | 0 |
| 0.8076388888888889 | 0 |
| 0.8083333333333332 | 0 |
| 0.8090277777777778 | 0 |
| 0.8097222222222222 | 0 |
| 0.8104166666666667 | 0 |
| 0.811111111111111 | 0 |
| 0.8118055555555556 | 0 |
| 0.8125 | 0 |
| 0.8131944444444444 | 0 |
| 0.813888888888889 | 0 |
| 0.8145833333333333 | 0 |
| 0.8152777777777778 | 0 |
| 0.8159722222222222 | 0 |
| 0.8166666666666668 | 0 |
| 0.8173611111111111 | 0 |
| 0.8180555555555555 | 0 |
| 0.81875 | 0 |
| 0.8194444444444445 | 0 |
| 0.8201388888888889 | 0 |
| 0.8208333333333333 | 0 |
| 0.8215277777777777 | 0 |
| 0.8222222222222223 | 0 |
| 0.8229166666666666 | 0 |
| 0.8236111111111111 | 0 |
| 0.8243055555555556 | 0 |
| 0.8250000000000001 | 0 |
| 0.8256944444444444 | 0 |
| 0.8263888888888888 | 0 |
| 0.8270833333333334 | 0 |
| 0.8277777777777778 | 0 |
| 0.8284722222222222 | 0 |
| 0.8291666666666666 | 0 |
| 0.8298611111111112 | 0 |
| 0.8305555555555556 | 0 |
| 0.8312499999999999 | 0 |
| 0.8319444444444444 | 0 |
| 0.8326388888888889 | 0 |
| 0.8333333333333334 | 0 |
| 0.8340277777777777 | 0 |
| 0.8347222222222223 | 0 |
| 0.8354166666666667 | 0 |
| 0.8361111111111111 | 0 |
| 0.8368055555555555 | 0 |
| 0.8375 | 0 |
| 0.8381944444444445 | 0 |
| 0.8388888888888889 | 0 |
| 0.8395833333333332 | 0 |
| 0.8402777777777778 | 0 |
| 0.8409722222222222 | 0 |
| 0.8416666666666667 | 0 |
| 0.842361111111111 | 0 |
| 0.8430555555555556 | 0 |
| 0.84375 | 0 |
| 0.8444444444444444 | 0 |
| 0.845138888888889 | 0 |
| 0.8458333333333333 | 0 |
| 0.8465277777777778 | 0 |
| 0.8472222222222222 | 0 |
| 0.8479166666666668 | 0 |
| 0.8486111111111111 | 0 |
| 0.8493055555555555 | 0 |
| 0.85 | 0 |
| 0.8506944444444445 | 0 |
| 0.8513888888888889 | 0 |
| 0.8520833333333333 | 0 |
| 0.8527777777777777 | 0 |
| 0.8534722222222223 | 0 |
| 0.8541666666666666 | 0 |
| 0.8548611111111111 | 0 |
| 0.8555555555555556 | 0 |
| 0.8562500000000001 | 0 |
| 0.8569444444444444 | 0 |
| 0.8576388888888888 | 0 |
| 0.8583333333333334 | 0 |
| 0.8590277777777778 | 0 |
| 0.8597222222222222 | 0 |
| 0.8604166666666666 | 0 |
| 0.8611111111111112 | 0 |
| 0.8618055555555556 | 0 |
| 0.8624999999999999 | 0 |
| 0.8631944444444444 | 0 |
| 0.8638888888888889 | 0 |
| 0.8645833333333334 | 0 |
| 0.8652777777777777 | 0 |
| 0.8659722222222223 | 0 |
| 0.8666666666666667 | 0 |
| 0.8673611111111111 | 0 |
| 0.8680555555555555 | 0 |
| 0.86875 | 0 |
| 0.8694444444444445 | 0 |
| 0.8701388888888889 | 0 |
| 0.8708333333333332 | 0 |
| 0.8715277777777778 | 0 |
| 0.8722222222222222 | 0 |
| 0.8729166666666667 | 0 |
| 0.873611111111111 | 0 |
| 0.8743055555555556 | 0 |
| 0.875 | 0 |
| 0.8756944444444444 | 0 |
| 0.876388888888889 | 0 |
| 0.8770833333333333 | 0 |
| 0.8777777777777778 | 0 |
| 0.8784722222222222 | 0 |
| 0.8791666666666668 | 0 |
| 0.8798611111111111 | 0 |
| 0.8805555555555555 | 0 |
| 0.88125 | 0 |
| 0.8819444444444445 | 0 |
| 0.8826388888888889 | 0 |
| 0.8833333333333333 | 0 |
| 0.8840277777777777 | 0 |
| 0.8847222222222223 | 0 |
| 0.8854166666666666 | 0 |
| 0.8861111111111111 | 0 |
| 0.8868055555555556 | 0 |
| 0.8875000000000001 | 0 |
| 0.8881944444444444 | 0 |
| 0.8888888888888888 | 0 |
| 0.8895833333333334 | 0 |
| 0.8902777777777778 | 0 |
| 0.8909722222222222 | 0 |
| 0.8916666666666666 | 0 |
| 0.8923611111111112 | 0 |
| 0.8930555555555556 | 0 |
| 0.8937499999999999 | 0 |
| 0.8944444444444444 | 0 |
| 0.8951388888888889 | 0 |
| 0.8958333333333334 | 0 |
| 0.8965277777777777 | 0 |
| 0.8972222222222223 | 0 |
| 0.8979166666666667 | 0 |
| 0.8986111111111111 | 0 |
| 0.8993055555555555 | 0 |
| 0.9 | 0 |
| 0.9006944444444445 | 0 |
| 0.9013888888888889 | 0 |
| 0.9020833333333332 | 0 |
| 0.9027777777777778 | 0 |
| 0.9034722222222222 | 0 |
| 0.9041666666666667 | 0 |
| 0.904861111111111 | 0 |
| 0.9055555555555556 | 0 |
| 0.90625 | 0 |
| 0.9069444444444444 | 0 |
| 0.907638888888889 | 0 |
| 0.9083333333333333 | 0 |
| 0.9090277777777778 | 0 |
| 0.9097222222222222 | 0 |
| 0.9104166666666668 | 0 |
| 0.9111111111111111 | 0 |
| 0.9118055555555555 | 0 |
| 0.9125 | 0 |
| 0.9131944444444445 | 0 |
| 0.9138888888888889 | 0 |
| 0.9145833333333333 | 0 |
| 0.9152777777777777 | 0 |
| 0.9159722222222223 | 0 |
| 0.9166666666666666 | 0 |
| 0.9173611111111111 | 0 |
| 0.9180555555555556 | 0 |
| 0.9187500000000001 | 0 |
| 0.9194444444444444 | 0 |
| 0.9201388888888888 | 0 |
| 0.9208333333333334 | 0 |
| 0.9215277777777778 | 0 |
| 0.9222222222222222 | 0 |
| 0.9229166666666666 | 0 |
| 0.9236111111111112 | 0 |
| 0.9243055555555556 | 0 |
| 0.9249999999999999 | 0 |
| 0.9256944444444444 | 0 |
| 0.9263888888888889 | 0 |
| 0.9270833333333334 | 0 |
| 0.9277777777777777 | 0 |
| 0.9284722222222223 | 0 |
| 0.9291666666666667 | 0 |
| 0.9298611111111111 | 0 |
| 0.9305555555555555 | 0 |
| 0.93125 | 0 |
| 0.9319444444444445 | 0 |
| 0.9326388888888889 | 0 |
| 0.9333333333333332 | 0 |
| 0.9340277777777778 | 0 |
| 0.9347222222222222 | 0 |
| 0.9354166666666667 | 0 |
| 0.936111111111111 | 0 |
| 0.9368055555555556 | 0 |
| 0.9375 | 0 |
| 0.9381944444444444 | 0 |
| 0.938888888888889 | 0 |
| 0.9395833333333333 | 0 |
| 0.9402777777777778 | 0 |
| 0.9409722222222222 | 0 |
| 0.9416666666666668 | 0 |
| 0.9423611111111111 | 0 |
| 0.9430555555555555 | 0 |
| 0.94375 | 0 |
| 0.9444444444444445 | 0 |
| 0.9451388888888889 | 0 |
| 0.9458333333333333 | 0 |
| 0.9465277777777777 | 0 |
| 0.9472222222222223 | 0 |
| 0.9479166666666666 | 0 |
| 0.9486111111111111 | 0 |
| 0.9493055555555556 | 0 |
| 0.9500000000000001 | 0 |
| 0.9506944444444444 | 0 |
| 0.9513888888888888 | 0 |
| 0.9520833333333334 | 0 |
| 0.9527777777777778 | 0 |
| 0.9534722222222222 | 0 |
| 0.9541666666666666 | 0 |
| 0.9548611111111112 | 0 |
| 0.9555555555555556 | 0 |
| 0.9562499999999999 | 0 |
| 0.9569444444444444 | 0 |
| 0.9576388888888889 | 0 |
| 0.9583333333333334 | 0 |
| 0.9590277777777777 | 0 |
| 0.9597222222222223 | 0 |
| 0.9604166666666667 | 0 |
| 0.9611111111111111 | 0 |
| 0.9618055555555555 | 0 |
| 0.9625 | 0 |
| 0.9631944444444445 | 0 |
| 0.9638888888888889 | 0 |
| 0.9645833333333332 | 0 |
| 0.9652777777777778 | 0 |
| 0.9659722222222222 | 0 |
| 0.9666666666666667 | 0 |
| 0.967361111111111 | 0 |
| 0.9680555555555556 | 0 |
| 0.96875 | 0 |
| 0.9694444444444444 | 0 |
| 0.970138888888889 | 0 |
| 0.9708333333333333 | 0 |
| 0.9715277777777778 | 0 |
| 0.9722222222222222 | 0 |
| 0.9729166666666668 | 0 |
| 0.9736111111111111 | 0 |
| 0.9743055555555555 | 0 |
| 0.975 | 0 |
| 0.9756944444444445 | 0 |
| 0.9763888888888889 | 0 |
| 0.9770833333333333 | 0 |
| 0.9777777777777777 | 0 |
| 0.9784722222222223 | 0 |
| 0.9791666666666666 | 0 |
| 0.9798611111111111 | 0 |
| 0.9805555555555556 | 0 |
| 0.9812500000000001 | 0 |
| 0.9819444444444444 | 0 |
| 0.9826388888888888 | 0 |
| 0.9833333333333334 | 0 |
| 0.9840277777777778 | 0 |
| 0.9847222222222222 | 0 |
| 0.9854166666666666 | 0 |
| 0.9861111111111112 | 0 |
| 0.9868055555555556 | 0 |
| 0.9874999999999999 | 0 |
| 0.9881944444444444 | 0 |
| 0.9888888888888889 | 0 |
| 0.9895833333333334 | 0 |
| 0.9902777777777777 | 0 |
| 0.9909722222222223 | 0 |
| 0.9916666666666667 | 0 |
| 0.9923611111111111 | 0 |
| 0.9930555555555555 | 0 |
| 0.99375 | 0 |
| 0.9944444444444445 | 0 |
| 0.9951388888888889 | 0 |
| 0.9958333333333332 | 0 |
| 0.9965277777777778 | 0 |
| 0.9972222222222222 | 0 |
| 0.9979166666666667 | 0 |
| 0.998611111111111 | 0 |
| 0.9993055555555556 | 0 |